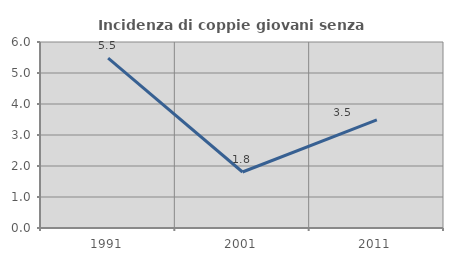
| Category | Incidenza di coppie giovani senza figli |
|---|---|
| 1991.0 | 5.482 |
| 2001.0 | 1.806 |
| 2011.0 | 3.488 |